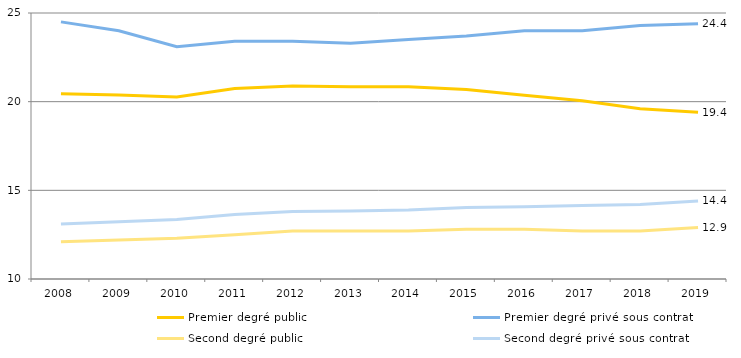
| Category | Premier degré public | Premier degré privé sous contrat | Second degré public | Second degré privé sous contrat |
|---|---|---|---|---|
| 2008.0 | 20.443 | 24.5 | 12.1 | 13.105 |
| 2009.0 | 20.377 | 24 | 12.2 | 13.227 |
| 2010.0 | 20.263 | 23.1 | 12.3 | 13.352 |
| 2011.0 | 20.743 | 23.4 | 12.5 | 13.635 |
| 2012.0 | 20.882 | 23.4 | 12.7 | 13.813 |
| 2013.0 | 20.844 | 23.3 | 12.7 | 13.841 |
| 2014.0 | 20.847 | 23.5 | 12.7 | 13.893 |
| 2015.0 | 20.687 | 23.7 | 12.8 | 14.035 |
| 2016.0 | 20.363 | 24 | 12.8 | 14.068 |
| 2017.0 | 20.053 | 24 | 12.7 | 14.14 |
| 2018.0 | 19.6 | 24.3 | 12.7 | 14.2 |
| 2019.0 | 19.4 | 24.4 | 12.9 | 14.4 |